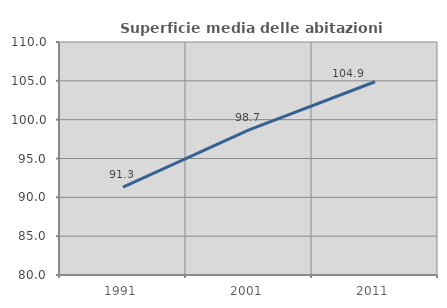
| Category | Superficie media delle abitazioni occupate |
|---|---|
| 1991.0 | 91.321 |
| 2001.0 | 98.683 |
| 2011.0 | 104.883 |